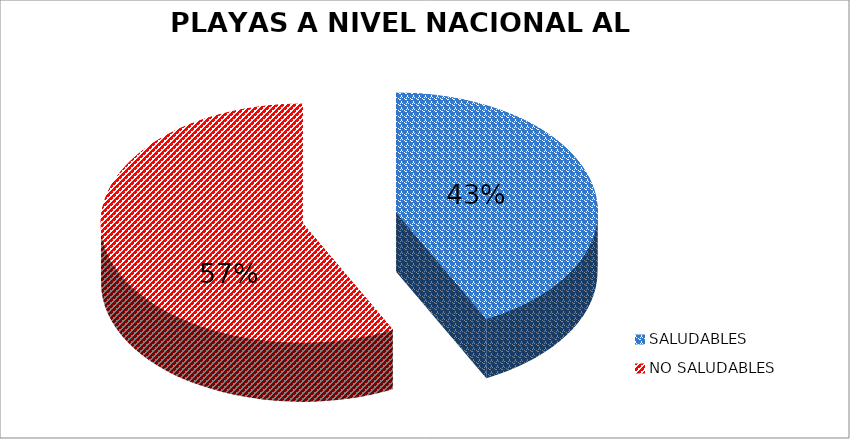
| Category | N.° |
|---|---|
| SALUDABLES | 98 |
| NO SALUDABLES | 132 |